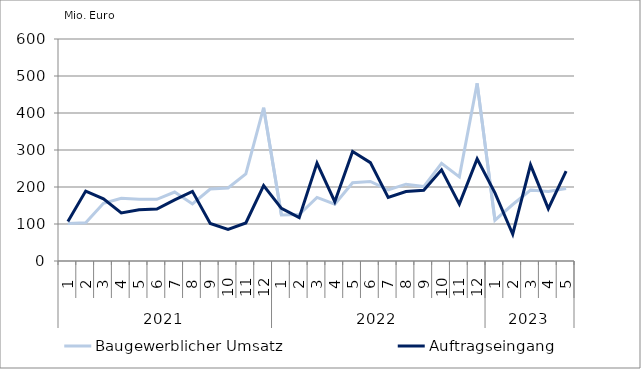
| Category | Baugewerblicher Umsatz | Auftragseingang |
|---|---|---|
| 0 | 101295.895 | 106850.127 |
| 1 | 103236.543 | 188883.434 |
| 2 | 156172.725 | 168204.42 |
| 3 | 169257.088 | 130052.073 |
| 4 | 166897.821 | 138492.214 |
| 5 | 166720.216 | 140262.426 |
| 6 | 186515.191 | 165331.191 |
| 7 | 154188.941 | 188169.655 |
| 8 | 194464.12 | 101359.538 |
| 9 | 197281.201 | 85626.862 |
| 10 | 235325.083 | 102880.924 |
| 11 | 414469.471 | 203900.676 |
| 12 | 124217.549 | 142351.759 |
| 13 | 125619.696 | 117194.423 |
| 14 | 171896.664 | 264509.013 |
| 15 | 153384.654 | 160146.519 |
| 16 | 211335.38 | 295997.826 |
| 17 | 214914.164 | 265813.917 |
| 18 | 192047.613 | 171529.517 |
| 19 | 207577.681 | 187809.656 |
| 20 | 201109.781 | 190941.096 |
| 21 | 264135.048 | 246250.021 |
| 22 | 227299.047 | 153783.993 |
| 23 | 480026.589 | 276019.328 |
| 24 | 110408.991 | 184068.731 |
| 25 | 152702.87 | 72330.186 |
| 26 | 191677.032 | 259741.102 |
| 27 | 187876.702 | 141464.389 |
| 28 | 195815.34 | 243069.898 |